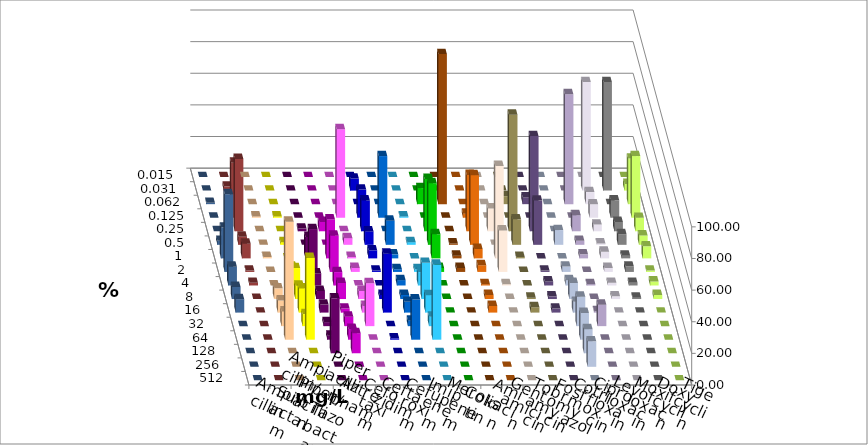
| Category | Ampicillin | Ampicillin/ Sulbactam | Piperacillin | Piperacillin/ Tazobactam | Aztreonam | Cefotaxim | Ceftazidim | Cefuroxim | Imipenem | Meropenem | Colistin | Amikacin | Gentamicin | Tobramycin | Fosfomycin | Cotrimoxazol | Ciprofloxacin | Levofloxacin | Moxifloxacin | Doxycyclin | Tigecyclin |
|---|---|---|---|---|---|---|---|---|---|---|---|---|---|---|---|---|---|---|---|---|---|
| 0.015 | 0 | 0 | 0 | 0 | 0 | 0 | 0 | 0 | 0 | 0 | 0 | 0 | 0 | 0 | 0 | 0 | 0 | 0 | 0 | 0 | 0 |
| 0.031 | 0 | 0 | 0 | 0 | 0 | 7.627 | 0 | 0 | 0 | 0 | 0 | 0 | 0 | 0 | 0 | 0 | 68.644 | 68.644 | 4.237 | 0 | 2.542 |
| 0.062 | 0 | 0 | 0 | 0 | 0 | 0 | 0 | 0 | 10.169 | 94.915 | 0 | 0 | 5.085 | 4.237 | 0 | 69.492 | 7.627 | 0 | 28.814 | 0.847 | 0 |
| 0.125 | 0.847 | 0.847 | 0 | 0 | 55.932 | 17.797 | 38.983 | 0.847 | 0 | 0 | 2.542 | 0 | 0 | 0 | 0 | 0 | 8.475 | 11.017 | 38.983 | 0 | 34.746 |
| 0.25 | 0 | 0 | 1.695 | 5.932 | 0 | 19.492 | 0 | 0 | 33.051 | 0 | 35.593 | 14.407 | 73.729 | 60.169 | 0 | 10.169 | 4.237 | 5.932 | 8.475 | 0 | 45.763 |
| 0.5 | 0 | 1.695 | 0 | 0 | 4.237 | 8.475 | 15.254 | 1.695 | 38.983 | 0.847 | 44.068 | 0 | 16.102 | 27.966 | 9.322 | 2.542 | 0.847 | 6.78 | 5.932 | 2.542 | 5.085 |
| 1.0 | 0.847 | 0 | 13.559 | 24.576 | 0.847 | 5.085 | 2.542 | 0 | 15.254 | 1.695 | 5.932 | 58.475 | 0.847 | 0 | 0 | 2.542 | 4.237 | 1.695 | 7.627 | 19.492 | 9.322 |
| 2.0 | 0 | 3.39 | 27.119 | 22.881 | 2.542 | 0.847 | 1.695 | 1.695 | 2.542 | 2.542 | 4.237 | 26.271 | 0 | 0.847 | 3.39 | 0 | 2.542 | 3.39 | 0.847 | 49.153 | 0.847 |
| 4.0 | 0 | 11.017 | 7.627 | 8.475 | 0 | 0 | 3.39 | 8.475 | 0 | 0 | 0.847 | 0.847 | 0 | 2.542 | 3.39 | 0.847 | 1.695 | 1.695 | 2.542 | 11.864 | 1.695 |
| 8.0 | 6.78 | 8.475 | 5.085 | 10.169 | 5.085 | 2.542 | 2.542 | 22.881 | 0 | 0 | 2.542 | 0 | 0.847 | 1.695 | 10.169 | 0 | 1.695 | 0.847 | 2.542 | 7.627 | 0 |
| 16.0 | 7.627 | 15.254 | 5.085 | 2.542 | 4.237 | 37.288 | 6.78 | 11.017 | 0 | 0 | 4.237 | 0 | 3.39 | 2.542 | 6.78 | 0.847 | 0 | 0 | 0 | 8.475 | 0 |
| 32.0 | 9.322 | 7.627 | 2.542 | 5.932 | 27.119 | 0 | 3.39 | 5.932 | 0 | 0 | 0 | 0 | 0 | 0 | 18.644 | 13.559 | 0 | 0 | 0 | 0 | 0 |
| 64.0 | 74.576 | 51.695 | 2.542 | 6.78 | 0 | 0.847 | 25.424 | 47.458 | 0 | 0 | 0 | 0 | 0 | 0 | 16.949 | 0 | 0 | 0 | 0 | 0 | 0 |
| 128.0 | 0 | 0 | 34.746 | 12.712 | 0 | 0 | 0 | 0 | 0 | 0 | 0 | 0 | 0 | 0 | 15.254 | 0 | 0 | 0 | 0 | 0 | 0 |
| 256.0 | 0 | 0 | 0 | 0 | 0 | 0 | 0 | 0 | 0 | 0 | 0 | 0 | 0 | 0 | 16.102 | 0 | 0 | 0 | 0 | 0 | 0 |
| 512.0 | 0 | 0 | 0 | 0 | 0 | 0 | 0 | 0 | 0 | 0 | 0 | 0 | 0 | 0 | 0 | 0 | 0 | 0 | 0 | 0 | 0 |